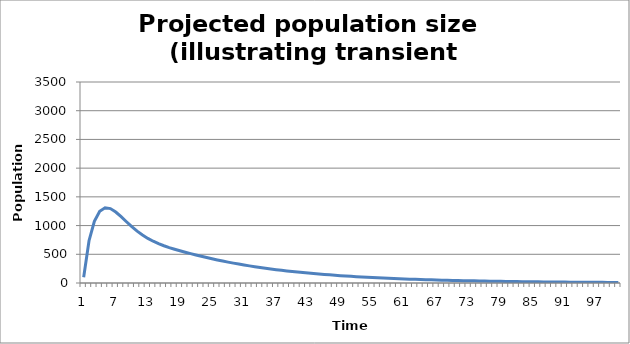
| Category | Series 0 |
|---|---|
| 0 | 100 |
| 1 | 736.651 |
| 2 | 1074.135 |
| 3 | 1249.355 |
| 4 | 1310.2 |
| 5 | 1295.678 |
| 6 | 1236.313 |
| 7 | 1154.628 |
| 8 | 1066.066 |
| 9 | 980.241 |
| 10 | 902.319 |
| 11 | 834.334 |
| 12 | 776.314 |
| 13 | 727.165 |
| 14 | 685.308 |
| 15 | 649.096 |
| 16 | 617.053 |
| 17 | 587.988 |
| 18 | 561.017 |
| 19 | 535.533 |
| 20 | 511.162 |
| 21 | 487.696 |
| 22 | 465.042 |
| 23 | 443.178 |
| 24 | 422.115 |
| 25 | 401.876 |
| 26 | 382.481 |
| 27 | 363.942 |
| 28 | 346.256 |
| 29 | 329.411 |
| 30 | 313.383 |
| 31 | 298.143 |
| 32 | 283.655 |
| 33 | 269.885 |
| 34 | 256.795 |
| 35 | 244.349 |
| 36 | 232.513 |
| 37 | 221.255 |
| 38 | 210.545 |
| 39 | 200.354 |
| 40 | 190.657 |
| 41 | 181.429 |
| 42 | 172.648 |
| 43 | 164.29 |
| 44 | 156.337 |
| 45 | 148.768 |
| 46 | 141.565 |
| 47 | 134.711 |
| 48 | 128.189 |
| 49 | 121.982 |
| 50 | 116.075 |
| 51 | 110.455 |
| 52 | 105.107 |
| 53 | 100.018 |
| 54 | 95.175 |
| 55 | 90.567 |
| 56 | 86.182 |
| 57 | 82.009 |
| 58 | 78.038 |
| 59 | 74.26 |
| 60 | 70.664 |
| 61 | 67.243 |
| 62 | 63.987 |
| 63 | 60.889 |
| 64 | 57.941 |
| 65 | 55.135 |
| 66 | 52.466 |
| 67 | 49.925 |
| 68 | 47.508 |
| 69 | 45.208 |
| 70 | 43.019 |
| 71 | 40.936 |
| 72 | 38.954 |
| 73 | 37.068 |
| 74 | 35.273 |
| 75 | 33.565 |
| 76 | 31.94 |
| 77 | 30.394 |
| 78 | 28.922 |
| 79 | 27.522 |
| 80 | 26.189 |
| 81 | 24.921 |
| 82 | 23.714 |
| 83 | 22.566 |
| 84 | 21.474 |
| 85 | 20.434 |
| 86 | 19.445 |
| 87 | 18.503 |
| 88 | 17.607 |
| 89 | 16.755 |
| 90 | 15.943 |
| 91 | 15.171 |
| 92 | 14.437 |
| 93 | 13.738 |
| 94 | 13.073 |
| 95 | 12.44 |
| 96 | 11.837 |
| 97 | 11.264 |
| 98 | 10.719 |
| 99 | 10.2 |
| 100 | 9.706 |